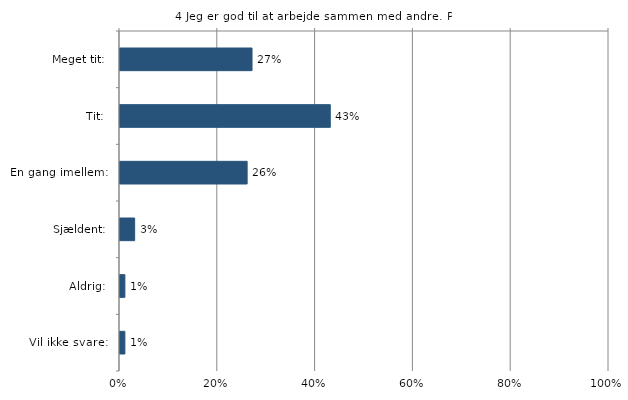
| Category | Jeg er god til at arbejde sammen med andre |
|---|---|
| Meget tit:  | 0.27 |
| Tit:  | 0.43 |
| En gang imellem:  | 0.26 |
| Sjældent:  | 0.03 |
| Aldrig:  | 0.01 |
| Vil ikke svare:  | 0.01 |